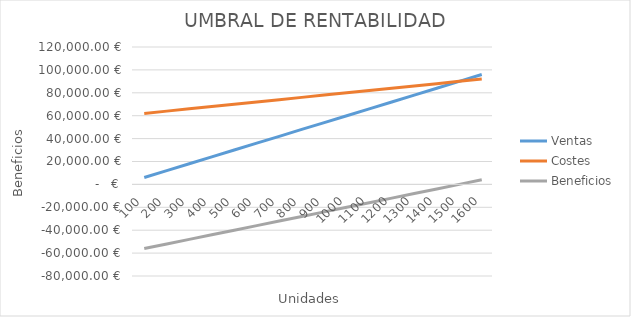
| Category | Ventas | Costes | Beneficios |
|---|---|---|---|
| 100.0 | 6000 | 62000 | -56000 |
| 200.0 | 12000 | 64000 | -52000 |
| 300.0 | 18000 | 66000 | -48000 |
| 400.0 | 24000 | 68000 | -44000 |
| 500.0 | 30000 | 70000 | -40000 |
| 600.0 | 36000 | 72000 | -36000 |
| 700.0 | 42000 | 74000 | -32000 |
| 800.0 | 48000 | 76000 | -28000 |
| 900.0 | 54000 | 78000 | -24000 |
| 1000.0 | 60000 | 80000 | -20000 |
| 1100.0 | 66000 | 82000 | -16000 |
| 1200.0 | 72000 | 84000 | -12000 |
| 1300.0 | 78000 | 86000 | -8000 |
| 1400.0 | 84000 | 88000 | -4000 |
| 1500.0 | 90000 | 90000 | 0 |
| 1600.0 | 96000 | 92000 | 4000 |